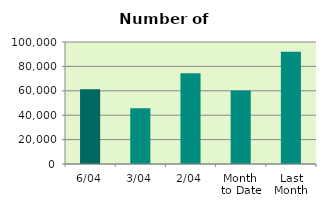
| Category | Series 0 |
|---|---|
| 6/04 | 61182 |
| 3/04 | 45600 |
| 2/04 | 74432 |
| Month 
to Date | 60338.5 |
| Last
Month | 92104.455 |